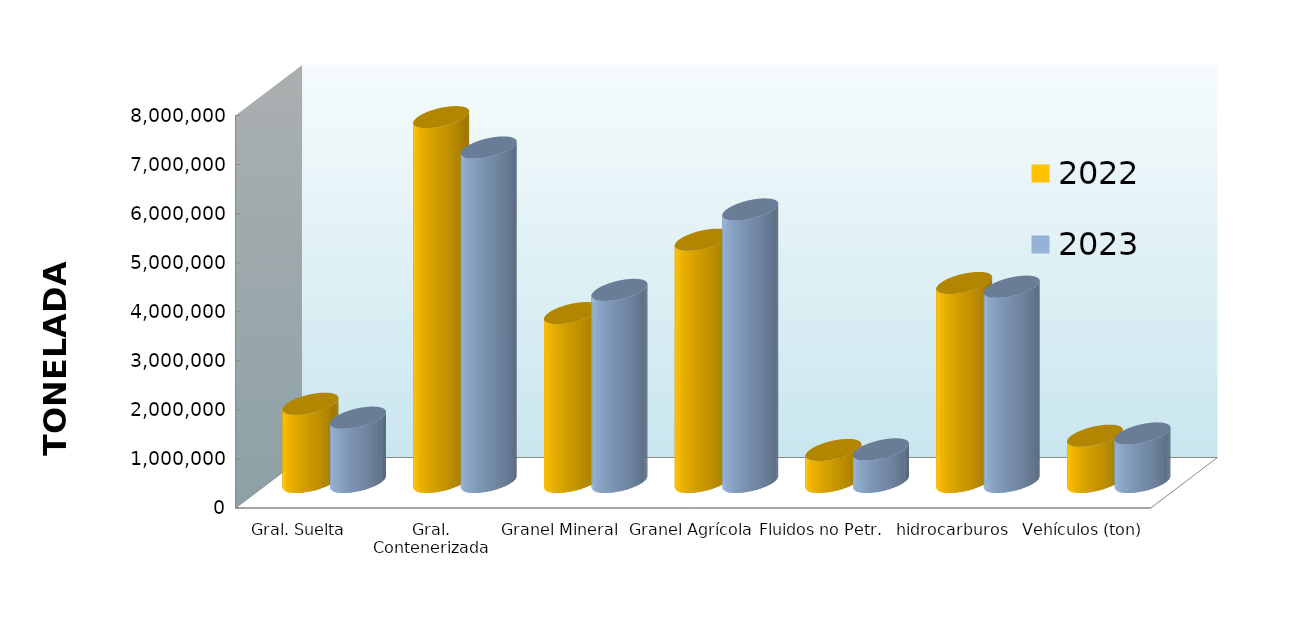
| Category | 2022 | 2023 |
|---|---|---|
| Gral. Suelta | 1594809.765 | 1311687.555 |
| Gral. Contenerizada | 7436359.441 | 6817562.328 |
| Granel Mineral | 3443094.013 | 3915826.572 |
| Granel Agrícola | 4937884.688 | 5555373.722 |
| Fluidos no Petr. | 652782.717 | 665699.018 |
| hidrocarburos | 4055675.887 | 3980956.377 |
| Vehículos (ton) | 942995.227 | 989892.245 |